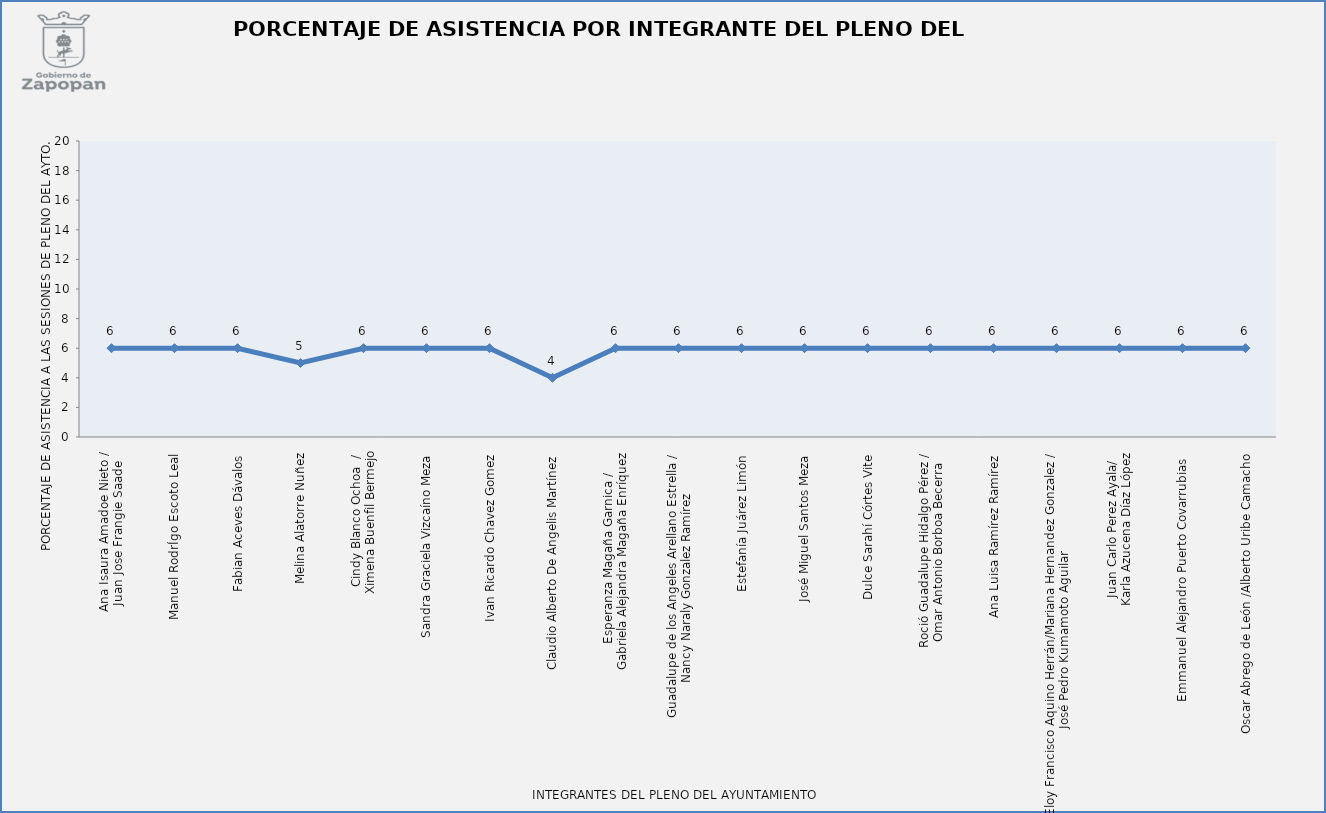
| Category | Series 0 |
|---|---|
| Ana Isaura Amadoe Nieto /
Juan Jose Frangie Saade  | 6 |
| Manuel RodrÍgo Escoto Leal  | 6 |
| Fabian Aceves Dávalos  | 6 |
| Melina Alatorre Nuñez | 5 |
| Cindy Blanco Ochoa  /
Ximena Buenfil Bermejo | 6 |
| Sandra Graciela Vizcaíno Meza  | 6 |
| Ivan Ricardo Chavez Gomez  | 6 |
| Claudio Alberto De Angelis Martínez  | 4 |
| Esperanza Magaña Garnica /
Gabriela Alejandra Magaña Enríquez  | 6 |
| Guadalupe de los Angeles Arellano Estrella /
Nancy Naraly Gonzalez Ramírez  | 6 |
| Estefanía Juárez Limón  | 6 |
| José Miguel Santos Meza  | 6 |
| Dulce Sarahí Córtes Vite  | 6 |
| Roció Guadalupe Hidalgo Pérez /
Omar Antonio Borboa Becerra  | 6 |
| Ana Luisa Ramírez Ramírez  | 6 |
|  Eloy Francisco Aquino Herrán/Mariana Hernandez Gonzalez /
José Pedro Kumamoto Aguilar   | 6 |
| Juan Carlo Perez Ayala/ 
Karla Azucena Díaz López  | 6 |
| Emmanuel Alejandro Puerto Covarrubias   | 6 |
| Oscar Abrego de León /Alberto Uribe Camacho  | 6 |